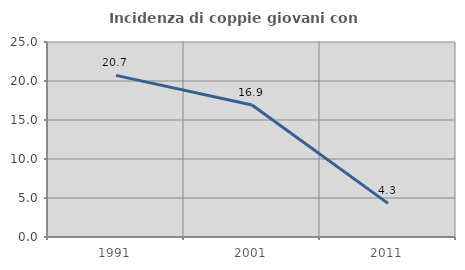
| Category | Incidenza di coppie giovani con figli |
|---|---|
| 1991.0 | 20.721 |
| 2001.0 | 16.923 |
| 2011.0 | 4.31 |